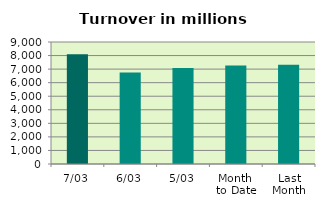
| Category | Series 0 |
|---|---|
| 7/03 | 8092.659 |
| 6/03 | 6741.642 |
| 5/03 | 7089.158 |
| Month 
to Date | 7265.455 |
| Last
Month | 7315.261 |